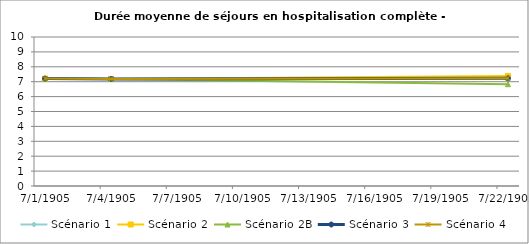
| Category | Scénario 1 | Scénario 2 | Scénario 2B | Scénario 3 | Scénario 4 |
|---|---|---|---|---|---|
| 2009.0 | 7.208 | 7.208 | 7.208 | 7.208 | 7.208 |
| 2012.0 | 7.184 | 7.184 | 7.184 | 7.184 | 7.184 |
| 2030.0 | 7.275 | 7.39 | 6.831 | 7.228 | 7.228 |